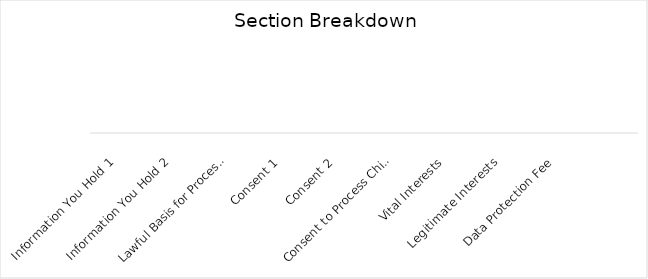
| Category | Series 0 | Series 1 | Series 2 |
|---|---|---|---|
| Information You Hold 1 | 0 | 0 | 0 |
| Information You Hold 2 | 0 | 0 | 0 |
| Lawful Basis for Processing | 0 | 0 | 0 |
| Consent 1 | 0 | 0 | 0 |
| Consent 2 | 0 | 0 | 0 |
| Consent to Process Children’s Personal Data for Online Services | 0 | 0 | 0 |
| Vital Interests | 0 | 0 | 0 |
| Legitimate Interests | 0 | 0 | 0 |
| Data Protection Fee | 0 | 0 | 0 |